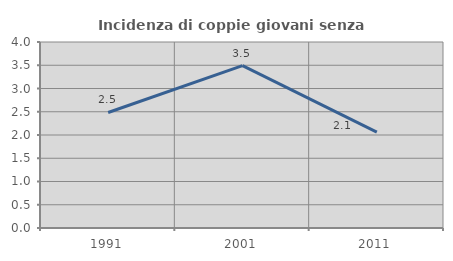
| Category | Incidenza di coppie giovani senza figli |
|---|---|
| 1991.0 | 2.484 |
| 2001.0 | 3.493 |
| 2011.0 | 2.06 |